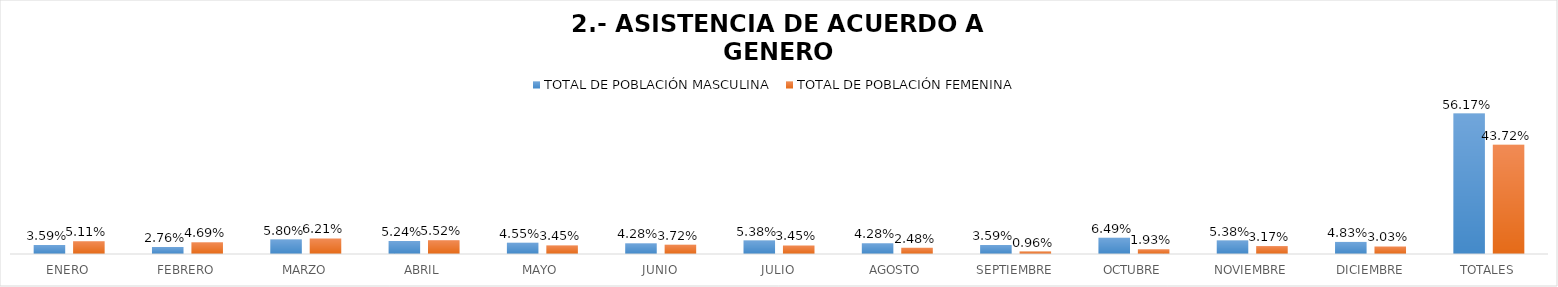
| Category | TOTAL DE POBLACIÓN MASCULINA | TOTAL DE POBLACIÓN FEMENINA |
|---|---|---|
| ENERO | 0.036 | 0.051 |
| FEBRERO | 0.028 | 0.047 |
| MARZO | 0.058 | 0.062 |
| ABRIL | 0.052 | 0.055 |
| MAYO | 0.046 | 0.034 |
| JUNIO | 0.043 | 0.037 |
| JULIO | 0.054 | 0.034 |
| AGOSTO | 0.043 | 0.025 |
| SEPTIEMBRE | 0.036 | 0.01 |
| OCTUBRE | 0.065 | 0.019 |
| NOVIEMBRE | 0.054 | 0.032 |
| DICIEMBRE | 0.048 | 0.03 |
| TOTALES | 0.562 | 0.437 |